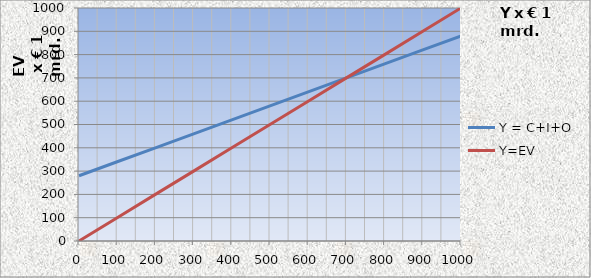
| Category | Y = C+I+O | Y=EV |
|---|---|---|
| 0.0 | 280 | 0 |
| 100.0 | 340 | 100 |
| 200.0 | 400 | 200 |
| 300.0 | 460 | 300 |
| 400.0 | 520 | 400 |
| 500.0 | 580 | 500 |
| 600.0 | 640 | 600 |
| 700.0 | 700 | 700 |
| 800.0 | 760 | 800 |
| 900.0 | 820 | 900 |
| 1000.0 | 880 | 1000 |